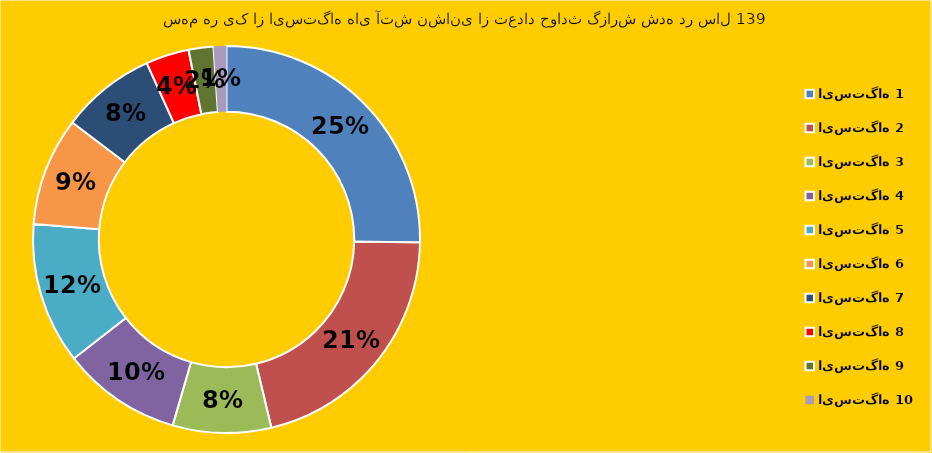
| Category | ایستگاه 1 ایستگاه 2 ایستگاه 3 ایستگاه 4  ایستگاه 5 ایستگاه 6 ایستگاه 7 ایستگاه 8 ایستگاه 9 |
|---|---|
| ایستگاه 1 | 329 |
| ایستگاه 2 | 274 |
| ایستگاه 3 | 107 |
| ایستگاه 4  | 130 |
| ایستگاه 5 | 154 |
| ایستگاه 6 | 118 |
| ایستگاه 7 | 103 |
| ایستگاه 8 | 47 |
| ایستگاه 9 | 27 |
| ایستگاه 10 | 14 |